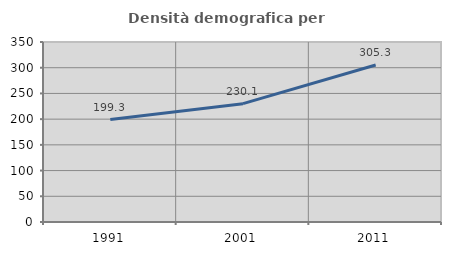
| Category | Densità demografica |
|---|---|
| 1991.0 | 199.285 |
| 2001.0 | 230.087 |
| 2011.0 | 305.298 |